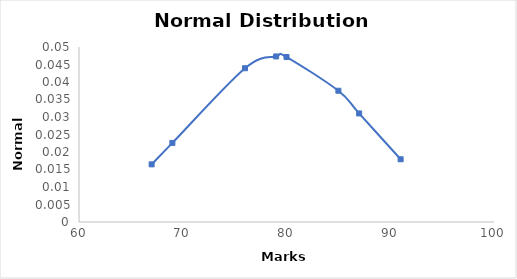
| Category | Series 0 |
|---|---|
| 67.0 | 0.016 |
| 69.0 | 0.023 |
| 76.0 | 0.044 |
| 79.0 | 0.047 |
| 80.0 | 0.047 |
| 85.0 | 0.038 |
| 87.0 | 0.031 |
| 91.0 | 0.018 |